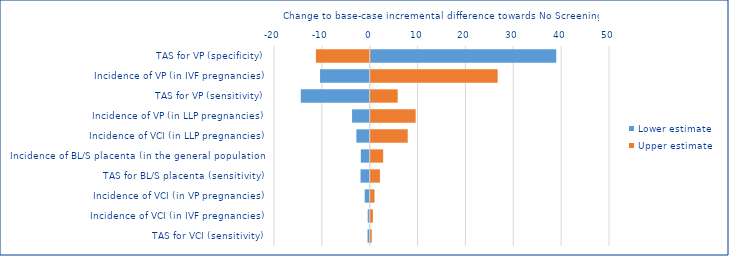
| Category | Lower estimate | Upper estimate |
|---|---|---|
| TAS for VP (specificity) | 38.772 | -11.24 |
| Incidence of VP (in IVF pregnancies) | -10.377 | 26.526 |
| TAS for VP (sensitivity) | -14.41 | 5.634 |
| Incidence of VP (in LLP pregnancies) | -3.686 | 9.393 |
| Incidence of VCI (in LLP pregnancies) | -2.788 | 7.733 |
| Incidence of BL/S placenta (in the general population) | -1.86 | 2.609 |
| TAS for BL/S placenta (sensitivity) | -1.92 | 1.92 |
| Incidence of VCI (in VP pregnancies) | -1.051 | 0.788 |
| Incidence of VCI (in IVF pregnancies) | -0.416 | 0.457 |
| TAS for VCI (sensitivity) | -0.452 | 0.221 |